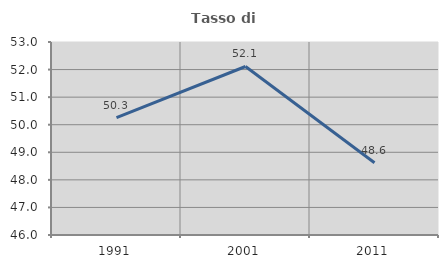
| Category | Tasso di occupazione   |
|---|---|
| 1991.0 | 50.254 |
| 2001.0 | 52.112 |
| 2011.0 | 48.622 |